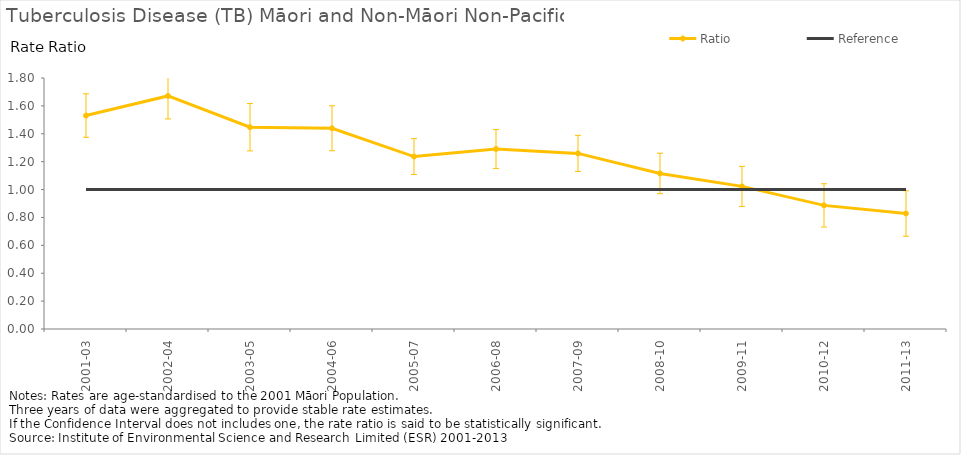
| Category | Ratio | Reference |
|---|---|---|
| 2001-03 | 1.531 | 1 |
| 2002-04 | 1.671 | 1 |
| 2003-05 | 1.447 | 1 |
| 2004-06 | 1.44 | 1 |
| 2005-07 | 1.237 | 1 |
| 2006-08 | 1.291 | 1 |
| 2007-09 | 1.259 | 1 |
| 2008-10 | 1.116 | 1 |
| 2009-11 | 1.023 | 1 |
| 2010-12 | 0.887 | 1 |
| 2011-13 | 0.828 | 1 |